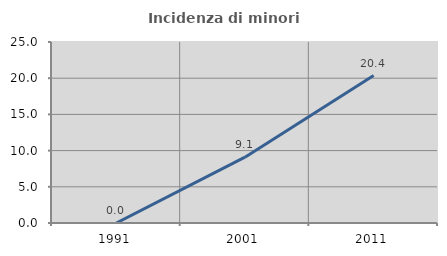
| Category | Incidenza di minori stranieri |
|---|---|
| 1991.0 | 0 |
| 2001.0 | 9.091 |
| 2011.0 | 20.37 |